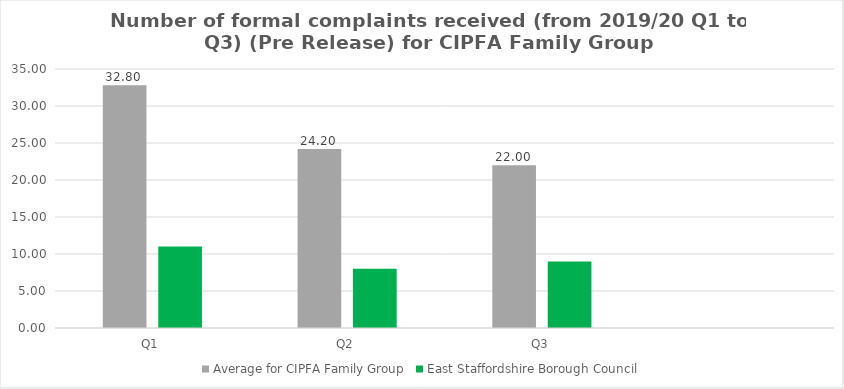
| Category | Average for CIPFA Family Group | East Staffordshire Borough Council |
|---|---|---|
| Q1 | 32.8 | 11 |
| Q2 | 24.2 | 8 |
| Q3 | 22 | 9 |